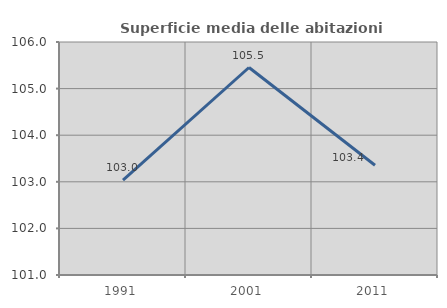
| Category | Superficie media delle abitazioni occupate |
|---|---|
| 1991.0 | 103.038 |
| 2001.0 | 105.453 |
| 2011.0 | 103.354 |